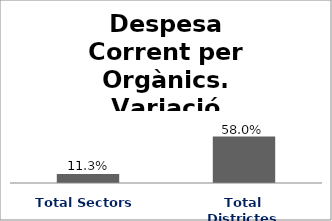
| Category | Series 0 |
|---|---|
| Total Sectors | 0.113 |
| Total Districtes | 0.58 |